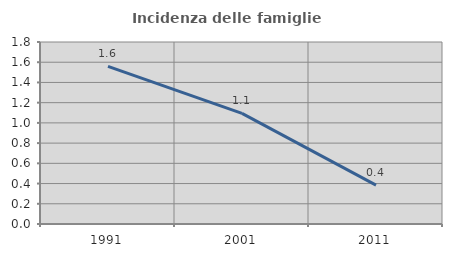
| Category | Incidenza delle famiglie numerose |
|---|---|
| 1991.0 | 1.559 |
| 2001.0 | 1.094 |
| 2011.0 | 0.384 |